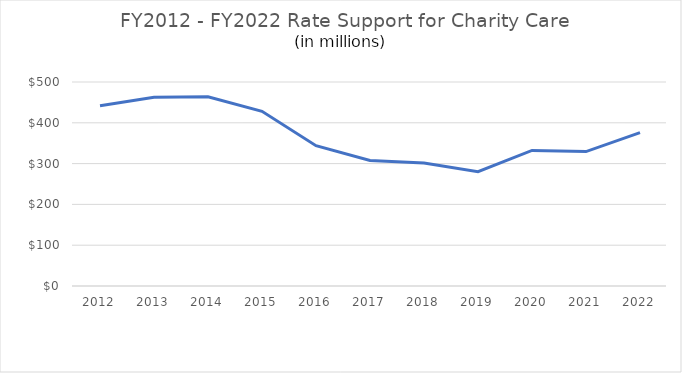
| Category | Series 1 |
|---|---|
| 2012.0 | 442.009 |
| 2013.0 | 462.59 |
| 2014.0 | 463.909 |
| 2015.0 | 428.142 |
| 2016.0 | 343.88 |
| 2017.0 | 307.579 |
| 2018.0 | 301.541 |
| 2019.0 | 280.321 |
| 2020.0 | 332.228 |
| 2021.0 | 329.411 |
| 2022.0 | 375.732 |